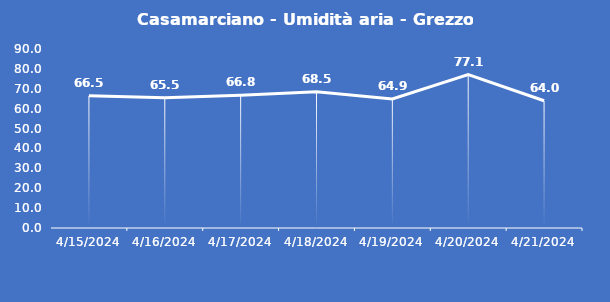
| Category | Casamarciano - Umidità aria - Grezzo (%) |
|---|---|
| 4/15/24 | 66.5 |
| 4/16/24 | 65.5 |
| 4/17/24 | 66.8 |
| 4/18/24 | 68.5 |
| 4/19/24 | 64.9 |
| 4/20/24 | 77.1 |
| 4/21/24 | 64 |